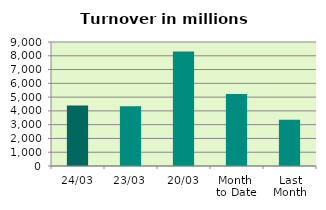
| Category | Series 0 |
|---|---|
| 24/03 | 4385.97 |
| 23/03 | 4341.401 |
| 20/03 | 8309.335 |
| Month 
to Date | 5218.852 |
| Last
Month | 3347.876 |